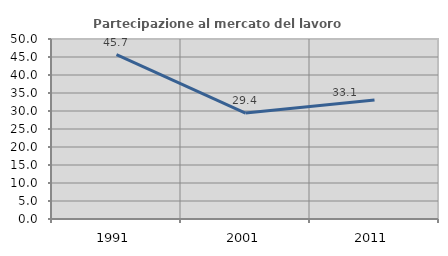
| Category | Partecipazione al mercato del lavoro  femminile |
|---|---|
| 1991.0 | 45.67 |
| 2001.0 | 29.441 |
| 2011.0 | 33.083 |